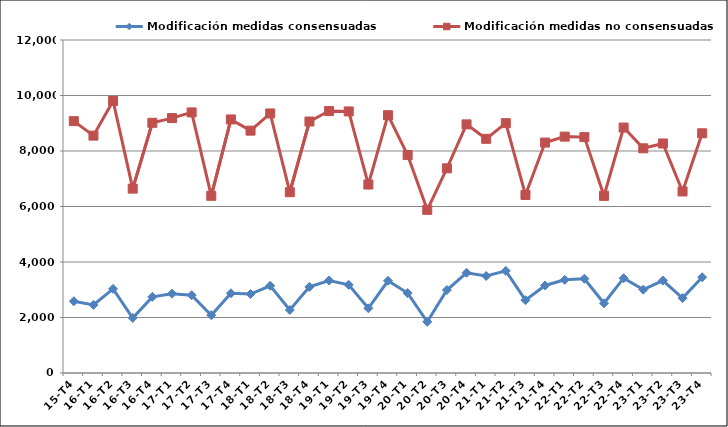
| Category | Modificación medidas consensuadas | Modificación medidas no consensuadas |
|---|---|---|
| 15-T4 | 2586 | 9076 |
| 16-T1 | 2455 | 8554 |
| 16-T2 | 3032 | 9802 |
| 16-T3 | 1983 | 6644 |
| 16-T4 | 2744 | 9017 |
| 17-T1 | 2859 | 9186 |
| 17-T2 | 2804 | 9391 |
| 17-T3 | 2082 | 6385 |
| 17-T4 | 2872 | 9137 |
| 18-T1 | 2846 | 8734 |
| 18-T2 | 3144 | 9353 |
| 18-T3 | 2272 | 6516 |
| 18-T4 | 3104 | 9063 |
| 19-T1 | 3335 | 9440 |
| 19-T2 | 3176 | 9426 |
| 19-T3 | 2332 | 6792 |
| 19-T4 | 3323 | 9291 |
| 20-T1 | 2880 | 7854 |
| 20-T2 | 1846 | 5880 |
| 20-T3 | 2991 | 7376 |
| 20-T4 | 3612 | 8960 |
| 21-T1 | 3496 | 8439 |
| 21-T2 | 3680 | 9003 |
| 21-T3 | 2625 | 6416 |
| 21-T4 | 3154 | 8304 |
| 22-T1 | 3359 | 8518 |
| 22-T2 | 3398 | 8500 |
| 22-T3 | 2512 | 6384 |
| 22-T4 | 3417 | 8845 |
| 23-T1 | 3003 | 8097 |
| 23-T2 | 3332 | 8271 |
| 23-T3 | 2699 | 6542 |
| 23-T4 | 3451 | 8638 |